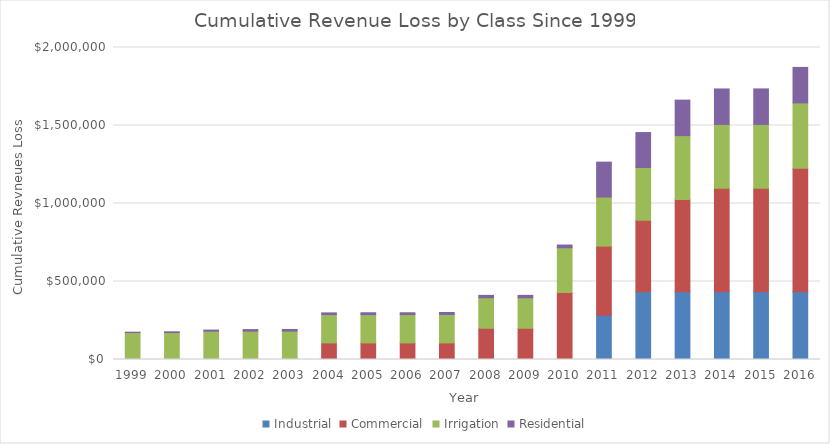
| Category | Industrial | Commercial | Irrigation | Residential |
|---|---|---|---|---|
| 1999.0 | 0 | 0 | 172760 | 2250 |
| 2000.0 | 0 | 0 | 172760 | 4720 |
| 2001.0 | 0 | 0 | 181481 | 7222 |
| 2002.0 | 0 | 0 | 181819 | 9893 |
| 2003.0 | 0 | 0 | 181819 | 10838 |
| 2004.0 | 0 | 106261 | 181819 | 10838 |
| 2005.0 | 0 | 106261 | 181819 | 11654 |
| 2006.0 | 0 | 106261 | 181819 | 11654 |
| 2007.0 | 0 | 106261 | 182466 | 12753 |
| 2008.0 | 0 | 200264 | 195393 | 15369 |
| 2009.0 | 0 | 200264 | 195393 | 15369 |
| 2010.0 | 0 | 429473 | 286849 | 17409 |
| 2011.0 | 283555.07 | 443244 | 314609.2 | 223797 |
| 2012.0 | 433578.07 | 458626 | 338709.2 | 223797 |
| 2013.0 | 433578.07 | 592759 | 408658.2 | 227573 |
| 2014.0 | 433578.07 | 664299 | 408838.2 | 227573 |
| 2015.0 | 433578.07 | 664563 | 408838.2 | 227573 |
| 2016.0 | 433578.07 | 792024 | 419130.22 | 227573 |